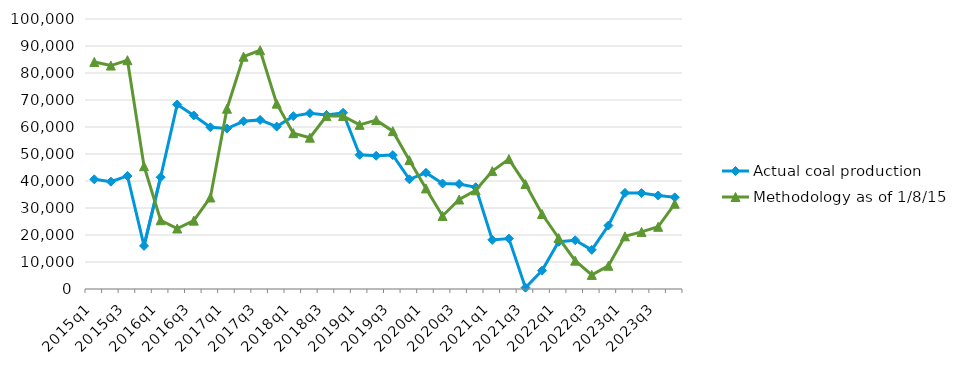
| Category | Actual coal production | Methodology as of 1/8/15 |
|---|---|---|
| 2015q1 | 40621 | 84090 |
| 2015q2 | 39757 | 82758 |
| 2015q3 | 41868 | 84739 |
| 2015q4 | 15960 | 45473 |
| 2016q1 | 41405 | 25461 |
| 2016q2 | 68329 | 22405 |
| 2016q3 | 64278 | 25324 |
| 2016q4 | 59886 | 33893 |
| 2017q1 | 59427 | 66782 |
| 2017q2 | 62122 | 86056 |
| 2017q3 | 62634 | 88420 |
| 2017q4 | 60162 | 68651 |
| 2018q1 | 64022 | 57712 |
| 2018q2 | 65120 | 56043 |
| 2018q3 | 64490 | 64036 |
| 2018q4 | 65270 | 64086 |
| 2019q1 | 49703 | 60803 |
| 2019q2 | 49342 | 62541 |
| 2019q3 | 49590 | 58465 |
| 2019q4 | 40638 | 47726 |
| 2020q1 | 43057 | 37259 |
| 2020q2 | 39084 | 27051 |
| 2020q3 | 38890 | 33141 |
| 2020q4 | 37708 | 36555 |
| 2021q1 | 18195 | 43665 |
| 2021q2 | 18671 | 48117 |
| 2021q3 | 487 | 38849 |
| 2021q4 | 6809 | 27781 |
| 2022q1 | 17493 | 18893 |
| 2022q2 | 18055 | 10501 |
| 2022q3 | 14481 | 5225 |
| 2022q4 | 23501 | 8604 |
| 2023q1 | 35589 | 19498 |
| 2023q2 | 35532 | 21144 |
| 2023q3 | 34630 | 23035 |
| 2023q4 | 33945 | 31569 |